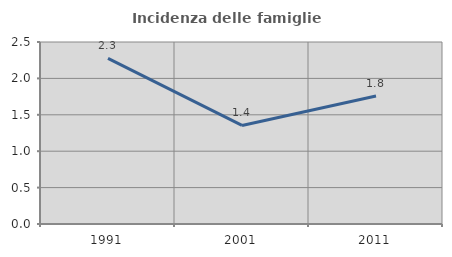
| Category | Incidenza delle famiglie numerose |
|---|---|
| 1991.0 | 2.274 |
| 2001.0 | 1.354 |
| 2011.0 | 1.759 |